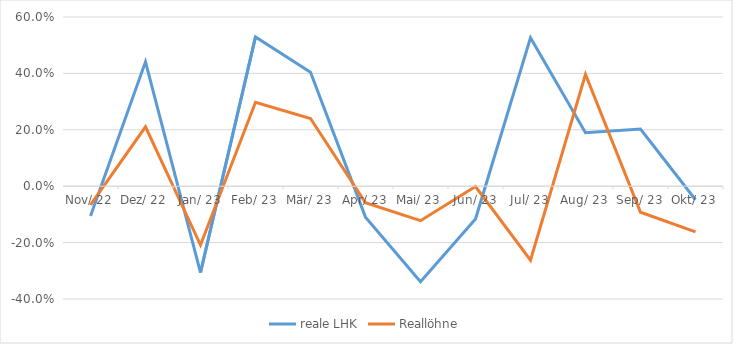
| Category | reale LHK | Reallöhne |
|---|---|---|
| 1922-11-06 | -0.105 | -0.066 |
| 1922-12-06 12:00:00 | 0.441 | 0.211 |
| 1923-01-06 | -0.306 | -0.209 |
| 1923-02-05 12:00:00 | 0.529 | 0.297 |
| 1923-03-08 | 0.404 | 0.24 |
| 1923-04-07 12:00:00 | -0.11 | -0.059 |
| 1923-05-08 | -0.338 | -0.122 |
| 1923-06-07 12:00:00 | -0.116 | -0.001 |
| 1923-07-08 | 0.526 | -0.262 |
| 1923-08-07 12:00:00 | 0.19 | 0.396 |
| 1923-09-07 | 0.203 | -0.092 |
| 1923-10-07 12:00:00 | -0.048 | -0.162 |